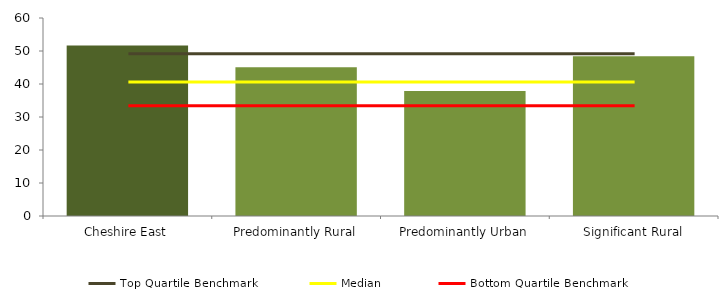
| Category | Series 0 |
|---|---|
| Cheshire East | 51.7 |
| Predominantly Rural | 45.1 |
| Predominantly Urban | 37.842 |
| Significant Rural | 48.4 |